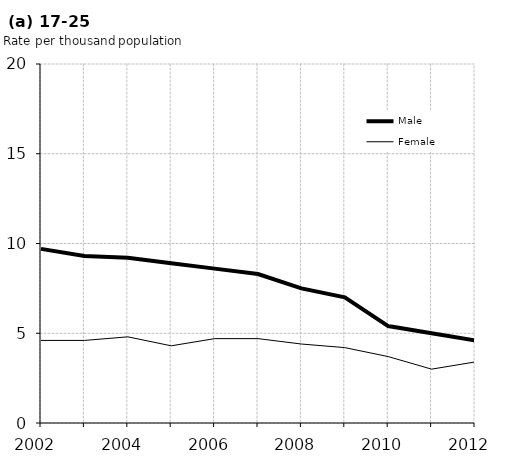
| Category | Male | Female |
|---|---|---|
| 2002.0 | 9.7 | 4.6 |
| 2003.0 | 9.3 | 4.6 |
| 2004.0 | 9.2 | 4.8 |
| 2005.0 | 8.9 | 4.3 |
| 2006.0 | 8.6 | 4.7 |
| 2007.0 | 8.3 | 4.7 |
| 2008.0 | 7.5 | 4.4 |
| 2009.0 | 7 | 4.2 |
| 2010.0 | 5.4 | 3.7 |
| 2011.0 | 5 | 3 |
| 2012.0 | 4.6 | 3.4 |